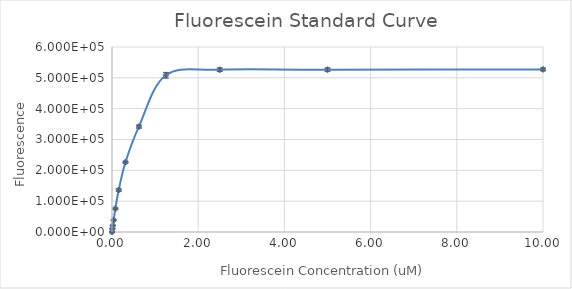
| Category | Series 0 |
|---|---|
| 10.0 | 527310.25 |
| 5.0 | 526498.75 |
| 2.5 | 526335.75 |
| 1.25 | 508300.25 |
| 0.625 | 341835.5 |
| 0.3125 | 226335 |
| 0.15625 | 136146 |
| 0.078125 | 75728 |
| 0.0390625 | 38468.5 |
| 0.01953125 | 20996.75 |
| 0.009765625 | 10487.5 |
| 0.0 | 78.25 |